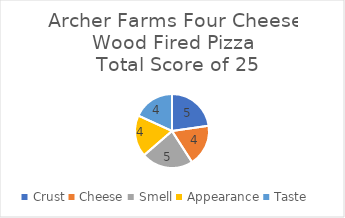
| Category | Series 0 |
|---|---|
| Crust | 5 |
| Cheese | 4 |
| Smell | 5 |
| Appearance | 4 |
| Taste | 4 |